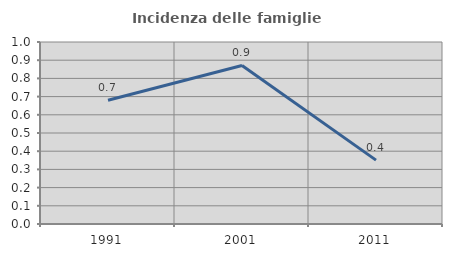
| Category | Incidenza delle famiglie numerose |
|---|---|
| 1991.0 | 0.68 |
| 2001.0 | 0.871 |
| 2011.0 | 0.351 |